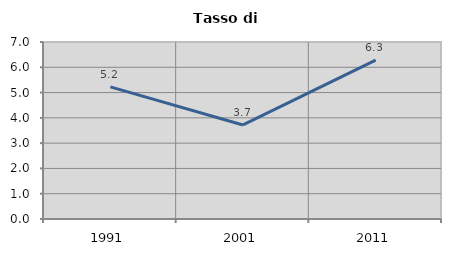
| Category | Tasso di disoccupazione   |
|---|---|
| 1991.0 | 5.227 |
| 2001.0 | 3.719 |
| 2011.0 | 6.283 |